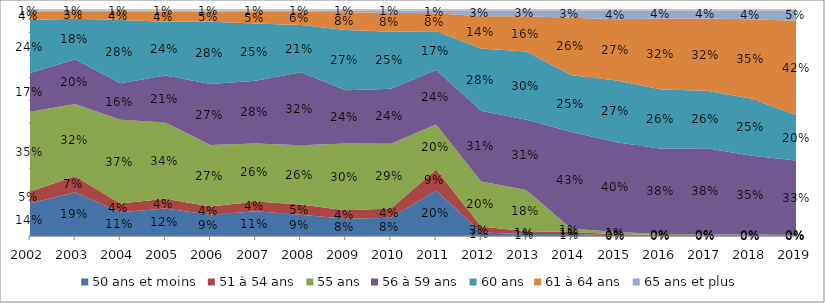
| Category | 50 ans et moins | 51 à 54 ans | 55 ans | 56 à 59 ans | 60 ans | 61 à 64 ans | 65 ans et plus |
|---|---|---|---|---|---|---|---|
| 2002.0 | 0.145 | 0.052 | 0.353 | 0.171 | 0.235 | 0.037 | 0.007 |
| 2003.0 | 0.193 | 0.072 | 0.319 | 0.198 | 0.179 | 0.034 | 0.005 |
| 2004.0 | 0.106 | 0.039 | 0.37 | 0.161 | 0.28 | 0.038 | 0.006 |
| 2005.0 | 0.122 | 0.043 | 0.338 | 0.208 | 0.238 | 0.045 | 0.007 |
| 2006.0 | 0.094 | 0.036 | 0.272 | 0.271 | 0.275 | 0.045 | 0.007 |
| 2007.0 | 0.109 | 0.043 | 0.257 | 0.278 | 0.253 | 0.052 | 0.008 |
| 2008.0 | 0.094 | 0.046 | 0.262 | 0.323 | 0.209 | 0.058 | 0.008 |
| 2009.0 | 0.076 | 0.038 | 0.296 | 0.236 | 0.266 | 0.078 | 0.01 |
| 2010.0 | 0.08 | 0.041 | 0.286 | 0.244 | 0.252 | 0.084 | 0.012 |
| 2011.0 | 0.201 | 0.093 | 0.199 | 0.241 | 0.172 | 0.08 | 0.014 |
| 2012.0 | 0.015 | 0.027 | 0.199 | 0.313 | 0.276 | 0.142 | 0.028 |
| 2013.0 | 0.009 | 0.012 | 0.182 | 0.311 | 0.302 | 0.157 | 0.027 |
| 2014.0 | 0.009 | 0.009 | 0.014 | 0.429 | 0.251 | 0.255 | 0.034 |
| 2015.0 | 0.003 | 0.004 | 0.01 | 0.397 | 0.274 | 0.271 | 0.041 |
| 2016.0 | 0.002 | 0.002 | 0.005 | 0.377 | 0.262 | 0.315 | 0.037 |
| 2017.0 | 0.002 | 0.003 | 0.002 | 0.381 | 0.255 | 0.319 | 0.037 |
| 2018.0 | 0.001 | 0.002 | 0.003 | 0.349 | 0.252 | 0.351 | 0.041 |
| 2019.0 | 0.001 | 0.002 | 0.002 | 0.328 | 0.201 | 0.418 | 0.048 |